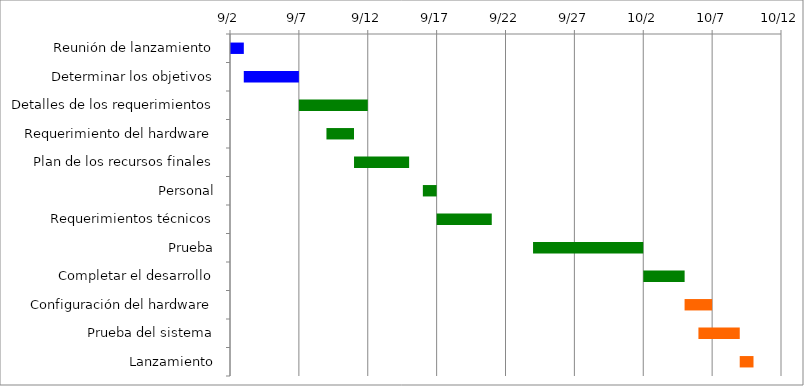
| Category | Fecha de inicio | Días |
|---|---|---|
| Reunión de lanzamiento | 2015-09-02 | 1 |
| Determinar los objetivos | 2015-09-03 | 4 |
| Detalles de los requerimientos | 2015-09-07 | 5 |
| Requerimiento del hardware | 2015-09-09 | 2 |
| Plan de los recursos finales | 2015-09-11 | 4 |
| Personal | 2015-09-16 | 1 |
| Requerimientos técnicos | 2015-09-17 | 4 |
| Prueba | 2015-09-24 | 8 |
| Completar el desarrollo | 2015-10-02 | 3 |
| Configuración del hardware | 2015-10-05 | 2 |
| Prueba del sistema | 2015-10-06 | 3 |
| Lanzamiento | 2015-10-09 | 1 |